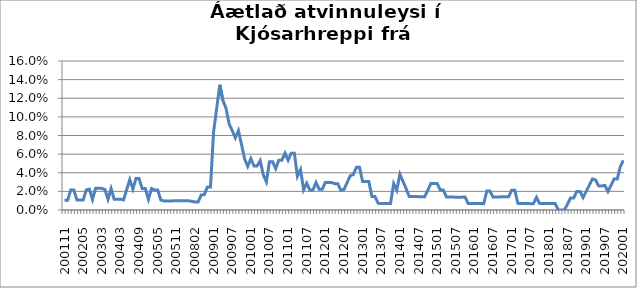
| Category | Series 0 |
|---|---|
| 200111 | 0.011 |
| 200112 | 0.011 |
| 200201 | 0.022 |
| 200202 | 0.022 |
| 200203 | 0.011 |
| 200204 | 0.011 |
| 200205 | 0.011 |
| 200206 | 0.022 |
| 200207 | 0.022 |
| 200212 | 0.011 |
| 200301 | 0.023 |
| 200302 | 0.023 |
| 200303 | 0.023 |
| 200304 | 0.022 |
| 200310 | 0.011 |
| 200311 | 0.023 |
| 200312 | 0.011 |
| 200401 | 0.012 |
| 200403 | 0.012 |
| 200404 | 0.011 |
| 200405 | 0.022 |
| 200406 | 0.033 |
| 200407 | 0.022 |
| 200408 | 0.034 |
| 200409 | 0.034 |
| 200410 | 0.023 |
| 200411 | 0.023 |
| 200412 | 0.011 |
| 200503 | 0.023 |
| 200504 | 0.022 |
| 200505 | 0.022 |
| 200506 | 0.011 |
| 200507 | 0.01 |
| 200508 | 0.01 |
| 200509 | 0.01 |
| 200510 | 0.01 |
| 200511 | 0.01 |
| 200512 | 0.01 |
| 200601 | 0.01 |
| 200602 | 0.01 |
| 200603 | 0.01 |
| 200604 | 0.009 |
| 200802 | 0.008 |
| 200803 | 0.008 |
| 200809 | 0.016 |
| 200810 | 0.017 |
| 200811 | 0.025 |
| 200812 | 0.025 |
| 200901 | 0.084 |
| 200902 | 0.109 |
| 200903 | 0.134 |
| 200904 | 0.118 |
| 200905 | 0.109 |
| 200906 | 0.092 |
| 200907 | 0.085 |
| 200908 | 0.078 |
| 200909 | 0.085 |
| 200910 | 0.07 |
| 200911 | 0.055 |
| 200912 | 0.047 |
| 201001 | 0.055 |
| 201002 | 0.047 |
| 201003 | 0.047 |
| 201004 | 0.053 |
| 201005 | 0.038 |
| 201006 | 0.03 |
| 201007 | 0.052 |
| 201008 | 0.052 |
| 201009 | 0.044 |
| 201010 | 0.053 |
| 201011 | 0.053 |
| 201012 | 0.061 |
| 201101 | 0.053 |
| 201102 | 0.061 |
| 201103 | 0.061 |
| 201104 | 0.036 |
| 201105 | 0.043 |
| 201106 | 0.022 |
| 201107 | 0.029 |
| 201108 | 0.022 |
| 201109 | 0.022 |
| 201110 | 0.03 |
| 201111 | 0.022 |
| 201112 | 0.022 |
| 201201 | 0.03 |
| 201202 | 0.03 |
| 201203 | 0.03 |
| 201204 | 0.028 |
| 201205 | 0.028 |
| 201206 | 0.021 |
| 201207 | 0.022 |
| 201208 | 0.029 |
| 201209 | 0.037 |
| 201210 | 0.038 |
| 201211 | 0.046 |
| 201212 | 0.046 |
| 201301 | 0.031 |
| 201302 | 0.031 |
| 201303 | 0.031 |
| 201304 | 0.014 |
| 201305 | 0.014 |
| 201306 | 0.007 |
| 201307 | 0.007 |
| 201308 | 0.007 |
| 201309 | 0.007 |
| 201310 | 0.007 |
| 201311 | 0.028 |
| 201312 | 0.021 |
| 201401 | 0.038 |
| 201402 | 0.031 |
| 201403 | 0.023 |
| 201404 | 0.015 |
| 201405 | 0.015 |
| 201406 | 0.015 |
| 201407 | 0.014 |
| 201408 | 0.014 |
| 201409 | 0.014 |
| 201410 | 0.021 |
| 201411 | 0.029 |
| 201412 | 0.029 |
| 201501 | 0.029 |
| 201502 | 0.021 |
| 201503 | 0.021 |
| 201504 | 0.014 |
| 201505 | 0.014 |
| 201506 | 0.014 |
| 201507 | 0.014 |
| 201508 | 0.014 |
| 201509 | 0.014 |
| 201510 | 0.014 |
| 201511 | 0.007 |
| 201512 | 0.007 |
| 201601 | 0.007 |
| 201602 | 0.007 |
| 201603 | 0.007 |
| 201604 | 0.007 |
| 201605 | 0.02 |
| 201606 | 0.02 |
| 201607 | 0.014 |
| 201608 | 0.014 |
| 201609 | 0.014 |
| 201610 | 0.014 |
| 201611 | 0.014 |
| 201612 | 0.014 |
| 201701 | 0.021 |
| 201702 | 0.021 |
| 201703 | 0.007 |
| 201704 | 0.007 |
| 201705 | 0.007 |
| 201706 | 0.007 |
| 201707 | 0.007 |
| 201708 | 0.007 |
| 201709 | 0.014 |
| 201710 | 0.007 |
| 201711 | 0.007 |
| 201712 | 0.007 |
| 201801 | 0.007 |
| 201802 | 0.007 |
| 201803 | 0.007 |
| 201804 | 0 |
| 201805 | 0 |
| 201806 | 0 |
| 201807 | 0.006 |
| 201808 | 0.013 |
| 201809 | 0.013 |
| 201810 | 0.02 |
| 201811 | 0.02 |
| 201812 | 0.013 |
| 201901 | 0.02 |
| 201902 | 0.027 |
| 201903 | 0.033 |
| 201904 | 0.032 |
| 201905 | 0.026 |
| 201906 | 0.026 |
| 201907 | 0.026 |
| 201908 | 0.02 |
| 201909 | 0.026 |
| 201910 | 0.033 |
| 201911 | 0.033 |
| 201912 | 0.047 |
| 202001 | 0.053 |